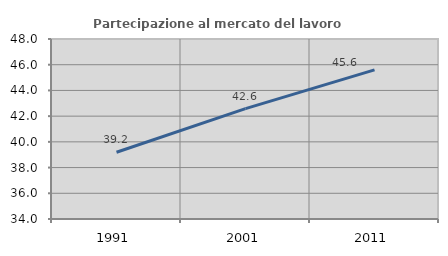
| Category | Partecipazione al mercato del lavoro  femminile |
|---|---|
| 1991.0 | 39.192 |
| 2001.0 | 42.589 |
| 2011.0 | 45.595 |